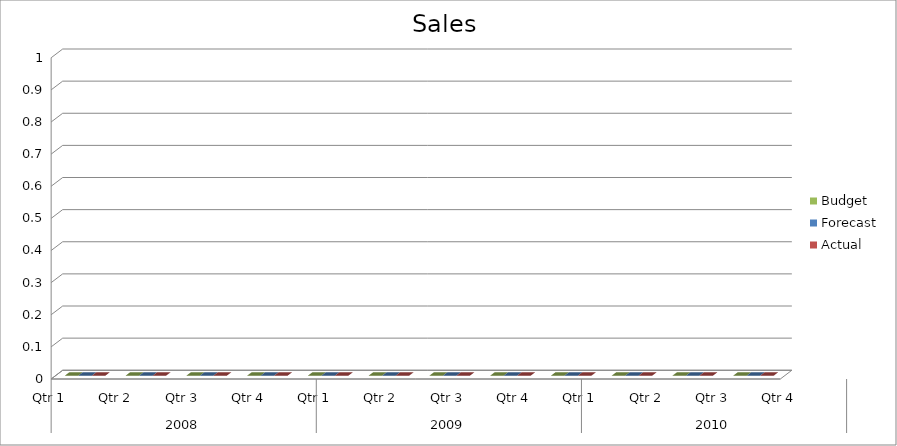
| Category | Budget | Forecast | Actual |
|---|---|---|---|
| 0 | 1250 | 2870 | 1770 |
| 1 | 1770 | 1170 | 1430 |
| 2 | 2310 | 1020 | 2000 |
| 3 | 920 | 2470 | 2210 |
| 4 | 2460 | 1060 | 1200 |
| 5 | 2880 | 1290 | 2340 |
| 6 | 1830 | 720 | 570 |
| 7 | 2380 | 3170 | 2260 |
| 8 | 3080 | 2240 | 620 |
| 9 | 1380 | 1340 | 780 |
| 10 | 630 | 970 | 3450 |
| 11 | 1110 | 3110 | 2670 |